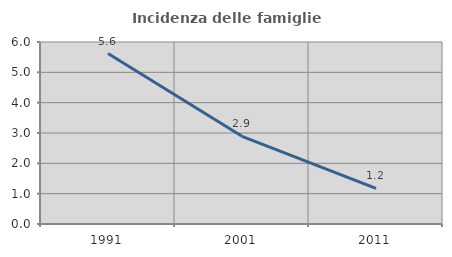
| Category | Incidenza delle famiglie numerose |
|---|---|
| 1991.0 | 5.618 |
| 2001.0 | 2.89 |
| 2011.0 | 1.171 |